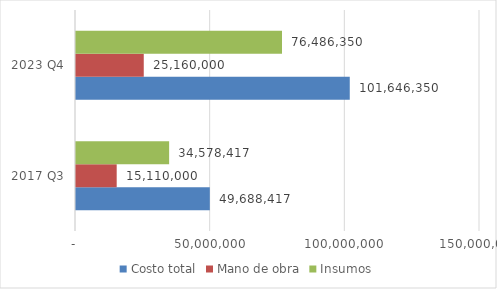
| Category | Costo total | Mano de obra | Insumos |
|---|---|---|---|
| 2017 Q3 | 49688417 | 15110000 | 34578417 |
| 2023 Q4 | 101646349.74 | 25160000 | 76486349.74 |